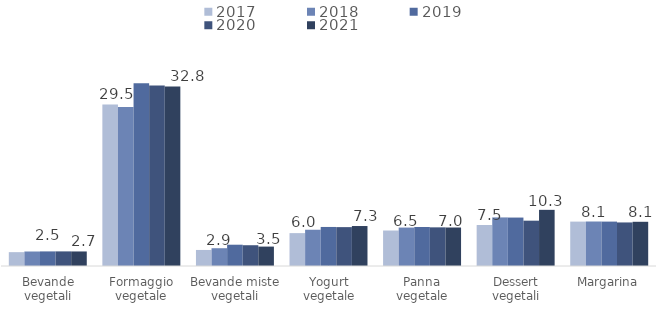
| Category | 2017 | 2018 | 2019 | 2020 | 2021 |
|---|---|---|---|---|---|
| Bevande vegetali | 2.529 | 2.649 | 2.666 | 2.668 | 2.655 |
| Formaggio vegetale | 29.519 | 29.051 | 33.374 | 32.986 | 32.796 |
| Bevande miste vegetali | 2.929 | 3.248 | 3.89 | 3.795 | 3.545 |
| Yogurt vegetale | 6.005 | 6.621 | 7.132 | 7.101 | 7.3 |
| Panna vegetale | 6.481 | 7.02 | 7.122 | 7.061 | 7.031 |
| Dessert vegetali | 7.484 | 8.874 | 8.848 | 8.278 | 10.258 |
| Margarina | 8.11 | 8.128 | 8.11 | 7.956 | 8.075 |